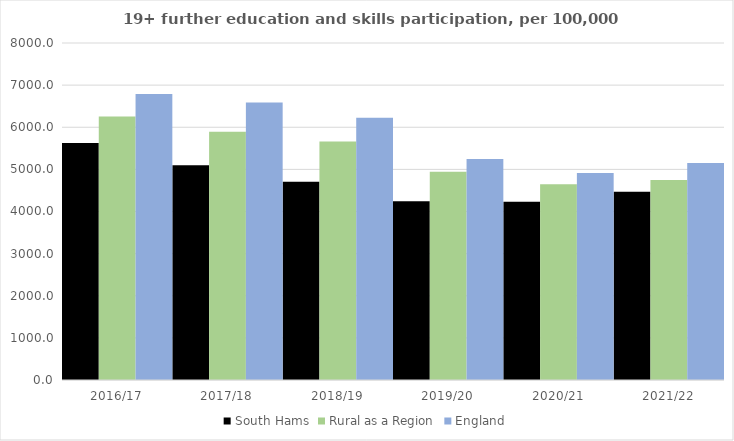
| Category | South Hams | Rural as a Region | England |
|---|---|---|---|
| 2016/17 | 5625 | 6253.401 | 6788 |
| 2017/18 | 5098 | 5892.029 | 6588 |
| 2018/19 | 4709 | 5661.873 | 6227 |
| 2019/20 | 4245 | 4943.801 | 5244 |
| 2020/21 | 4232 | 4646.727 | 4913 |
| 2021/22 | 4471 | 4747.049 | 5151 |